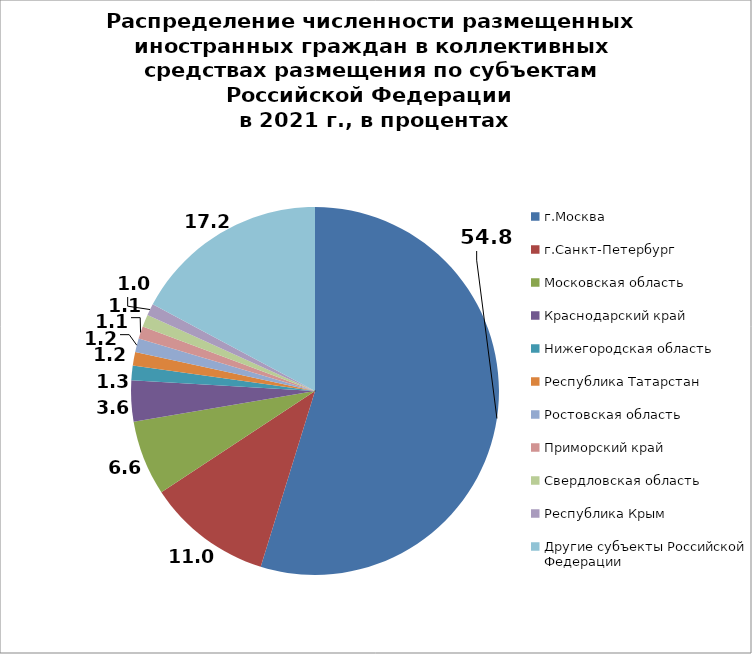
| Category | Series 0 |
|---|---|
| г.Москва | 54.768 |
| г.Санкт-Петербург | 10.96 |
| Московская область | 6.592 |
| Краснодарский край | 3.609 |
| Нижегородская область | 1.284 |
| Республика Татарстан | 1.194 |
| Ростовская область | 1.194 |
| Приморский край | 1.107 |
| Свердловская область | 1.079 |
| Республика Крым | 1.027 |
| Другие субъекты Российской Федерации | 17.188 |